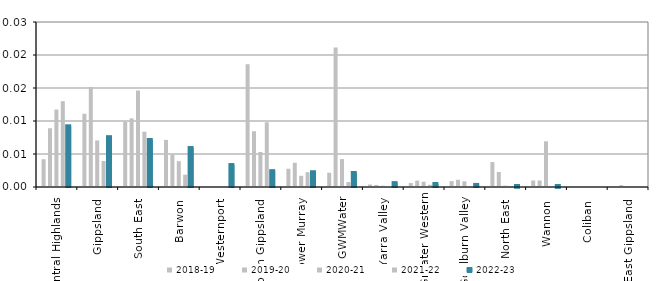
| Category | 2018-19 | 2019-20 | 2020-21 | 2021-22 | 2022-23 |
|---|---|---|---|---|---|
| Central Highlands  | 0.004 | 0.009 | 0.012 | 0.013 | 0.009 |
| Gippsland  | 0.011 | 0.015 | 0.007 | 0.004 | 0.008 |
| South East  | 0.01 | 0.01 | 0.015 | 0.008 | 0.007 |
| Barwon  | 0.007 | 0.005 | 0.004 | 0.002 | 0.006 |
| Westernport  | 0 | 0 | 0 | 0 | 0.003 |
| South Gippsland  | 0.019 | 0.008 | 0.005 | 0.01 | 0.002 |
| Lower Murray  | 0.003 | 0.004 | 0.002 | 0.002 | 0.002 |
| GWMWater | 0.002 | 0.021 | 0.004 | 0.001 | 0.002 |
| Yarra Valley  | 0 | 0 | 0 | 0 | 0.001 |
| Greater Western | 0.001 | 0.001 | 0.001 | 0 | 0 |
| Goulburn Valley  | 0.001 | 0.001 | 0.001 | 0 | 0 |
| North East  | 0.004 | 0.002 | 0 | 0 | 0 |
| Wannon  | 0.001 | 0.001 | 0.007 | 0 | 0 |
| Coliban  | 0 | 0 | 0 | 0 | 0 |
| East Gippsland  | 0 | 0 | 0 | 0 | 0 |